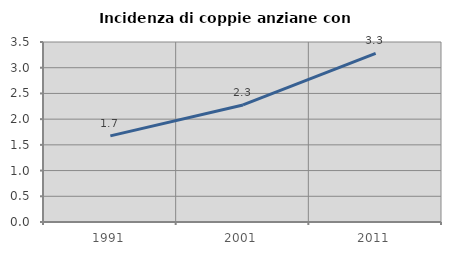
| Category | Incidenza di coppie anziane con figli |
|---|---|
| 1991.0 | 1.675 |
| 2001.0 | 2.276 |
| 2011.0 | 3.278 |